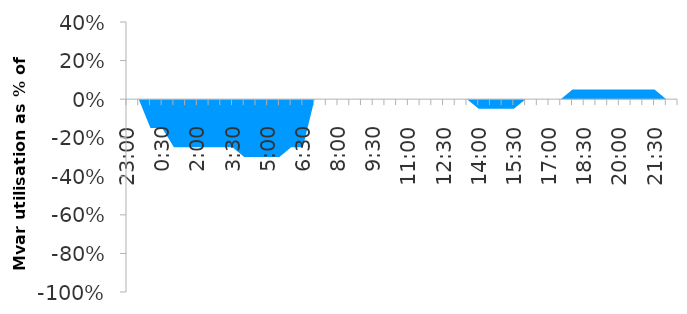
| Category | Series 0 |
|---|---|
| 0.9583333333333334 | 0 |
| 0.9791666666666666 | 0 |
| 0.0 | -0.15 |
| 0.020833333333333332 | -0.15 |
| 0.041666666666666664 | -0.25 |
| 0.0625 | -0.25 |
| 0.08333333333333333 | -0.25 |
| 0.10416666666666667 | -0.25 |
| 0.125 | -0.25 |
| 0.14583333333333334 | -0.25 |
| 0.16666666666666666 | -0.3 |
| 0.1875 | -0.3 |
| 0.20833333333333334 | -0.3 |
| 0.22916666666666666 | -0.3 |
| 0.25 | -0.25 |
| 0.2708333333333333 | -0.25 |
| 0.2916666666666667 | 0 |
| 0.3125 | 0 |
| 0.3333333333333333 | 0 |
| 0.3541666666666667 | 0 |
| 0.375 | 0 |
| 0.3958333333333333 | 0 |
| 0.4166666666666667 | 0 |
| 0.4375 | 0 |
| 0.4583333333333333 | 0 |
| 0.4791666666666667 | 0 |
| 0.5 | 0 |
| 0.5208333333333334 | 0 |
| 0.5416666666666666 | 0 |
| 0.5625 | 0 |
| 0.5833333333333334 | -0.05 |
| 0.6041666666666666 | -0.05 |
| 0.625 | -0.05 |
| 0.6458333333333334 | -0.05 |
| 0.6666666666666666 | 0 |
| 0.6875 | 0 |
| 0.7083333333333334 | 0 |
| 0.7291666666666666 | 0 |
| 0.75 | 0.05 |
| 0.7708333333333334 | 0.05 |
| 0.7916666666666666 | 0.05 |
| 0.8125 | 0.05 |
| 0.8333333333333334 | 0.05 |
| 0.8541666666666666 | 0.05 |
| 0.875 | 0.05 |
| 0.8958333333333334 | 0.05 |
| 0.9166666666666666 | 0 |
| 0.9375 | 0 |